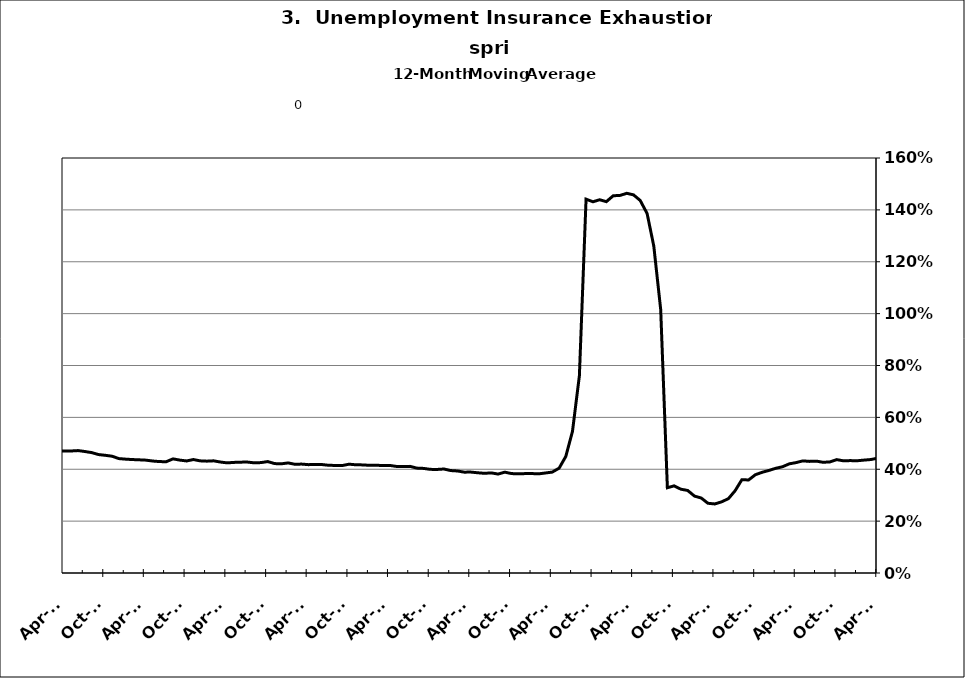
| Category | Series 0 |
|---|---|
| 2002-12-31 | 0.428 |
| 2003-01-31 | 0.432 |
| 2003-02-28 | 0.437 |
| 2003-03-31 | 0.445 |
| 2003-04-30 | 0.455 |
| 2003-05-31 | 0.466 |
| 2003-06-30 | 0.475 |
| 2003-07-31 | 0.485 |
| 2003-08-31 | 0.499 |
| 2003-09-30 | 0.502 |
| 2003-10-31 | 0.5 |
| 2003-11-30 | 0.506 |
| 2003-12-31 | 0.505 |
| 2004-01-31 | 0.505 |
| 2004-02-29 | 0.507 |
| 2004-03-31 | 0.501 |
| 2004-04-30 | 0.491 |
| 2004-05-31 | 0.486 |
| 2004-06-30 | 0.477 |
| 2004-07-31 | 0.466 |
| 2004-08-31 | 0.464 |
| 2004-09-30 | 0.452 |
| 2004-10-31 | 0.448 |
| 2004-11-30 | 0.44 |
| 2004-12-31 | 0.429 |
| 2005-01-31 | 0.429 |
| 2005-02-28 | 0.418 |
| 2005-03-31 | 0.412 |
| 2005-04-30 | 0.409 |
| 2005-05-31 | 0.404 |
| 2005-06-30 | 0.398 |
| 2005-07-31 | 0.4 |
| 2005-08-31 | 0.398 |
| 2005-09-30 | 0.398 |
| 2005-10-31 | 0.398 |
| 2005-11-30 | 0.392 |
| 2005-12-31 | 0.391 |
| 2006-01-31 | 0.388 |
| 2006-02-28 | 0.385 |
| 2006-03-31 | 0.381 |
| 2006-04-30 | 0.383 |
| 2006-05-31 | 0.387 |
| 2006-06-30 | 0.387 |
| 2006-07-31 | 0.393 |
| 2006-08-31 | 0.401 |
| 2006-09-30 | 0.415 |
| 2006-10-31 | 0.422 |
| 2006-11-30 | 0.423 |
| 2006-12-31 | 0.427 |
| 2007-01-31 | 0.425 |
| 2007-02-28 | 0.427 |
| 2007-03-31 | 0.431 |
| 2007-04-30 | 0.437 |
| 2007-05-31 | 0.434 |
| 2007-06-30 | 0.436 |
| 2007-07-30 | 0.443 |
| 2007-08-31 | 0.435 |
| 2007-09-30 | 0.437 |
| 2007-10-31 | 0.433 |
| 2007-11-15 | 0.438 |
| 2007-12-15 09:36:00 | 0.446 |
| 2008-01-14 19:12:00 | 0.447 |
| 2008-02-14 04:48:00 | 0.455 |
| 2008-03-15 14:24:00 | 0.462 |
| 2008-04-15 | 0.462 |
| 2008-05-15 09:36:00 | 0.467 |
| 2008-06-14 19:12:00 | 0.475 |
| 2008-07-15 04:48:00 | 0.47 |
| 2008-08-14 14:24:00 | 0.469 |
| 2008-09-14 | 0.473 |
| 2008-10-14 09:36:00 | 0.478 |
| 2008-11-13 19:12:00 | 0.489 |
| 2008-12-14 04:48:00 | 0.497 |
| 2009-01-13 14:24:00 | 0.51 |
| 2009-02-13 | 0.528 |
| 2009-03-15 09:36:00 | 0.547 |
| 2009-04-14 19:12:00 | 0.565 |
| 2009-05-15 04:48:00 | 0.582 |
| 2009-06-14 14:24:00 | 0.6 |
| 2009-07-15 | 0.611 |
| 2009-08-14 09:36:00 | 0.631 |
| 2009-09-13 19:12:00 | 0.623 |
| 2009-10-14 04:48:00 | 0.631 |
| 2009-11-13 14:24:00 | 0.65 |
| 2009-12-14 | 0.65 |
| 2010-01-13 09:36:00 | 0.657 |
| 2010-02-12 19:12:00 | 0.652 |
| 2010-03-15 04:48:00 | 0.649 |
| 2010-04-14 14:24:00 | 0.636 |
| 2010-05-15 | 0.623 |
| 2010-06-14 09:36:00 | 0.615 |
| 2010-07-14 19:12:00 | 0.604 |
| 2010-08-14 04:48:00 | 0.596 |
| 2010-09-13 14:24:00 | 0.591 |
| 2010-10-14 | 0.608 |
| 2010-11-13 09:36:00 | 0.605 |
| 2010-12-13 19:12:00 | 0.6 |
| 2011-01-13 04:48:00 | 0.602 |
| 2011-02-12 14:24:00 | 0.595 |
| 2011-03-15 | 0.587 |
| 2011-04-14 09:36:00 | 0.584 |
| 2011-05-14 19:12:00 | 0.591 |
| 2011-06-14 04:48:00 | 0.588 |
| 2011-07-14 14:24:00 | 0.582 |
| 2011-08-14 | 0.586 |
| 2011-09-13 09:36:00 | 0.59 |
| 2011-10-13 19:12:00 | 0.576 |
| 2011-11-13 04:48:00 | 0.561 |
| 2011-12-13 14:24:00 | 0.56 |
| 2012-01-13 | 0.555 |
| 2012-02-12 09:36:00 | 0.551 |
| 2012-03-13 19:12:00 | 0.544 |
| 2012-04-13 04:48:00 | 0.544 |
| 2012-05-13 14:24:00 | 0.535 |
| 2012-06-13 | 0.53 |
| 2012-07-13 09:36:00 | 0.535 |
| 2012-08-12 19:12:00 | 0.513 |
| 2012-09-12 04:48:00 | 0.506 |
| 2012-10-12 14:24:00 | 0.494 |
| 2012-11-12 | 0.484 |
| 2012-12-12 09:36:00 | 0.481 |
| 2013-01-11 19:12:00 | 0.465 |
| 2013-02-11 04:48:00 | 0.461 |
| 2013-03-13 14:24:00 | 0.462 |
| 2013-04-13 | 0.459 |
| 2013-05-13 09:36:00 | 0.458 |
| 2013-06-12 19:12:00 | 0.452 |
| 2013-07-13 04:48:00 | 0.451 |
| 2013-08-12 14:24:00 | 0.454 |
| 2013-09-12 | 0.465 |
| 2013-10-12 09:36:00 | 0.463 |
| 2013-11-11 19:12:00 | 0.466 |
| 2013-12-12 04:48:00 | 0.475 |
| 2014-01-11 14:24:00 | 0.477 |
| 2014-02-11 | 0.475 |
| 2014-03-13 09:36:00 | 0.471 |
| 2014-04-12 19:12:00 | 0.47 |
| 2014-05-13 04:48:00 | 0.471 |
| 2014-06-12 14:24:00 | 0.472 |
| 2014-07-13 | 0.468 |
| 2014-08-12 09:36:00 | 0.464 |
| 2014-09-11 19:12:00 | 0.457 |
| 2014-10-12 04:48:00 | 0.454 |
| 2014-11-11 14:24:00 | 0.45 |
| 2014-12-12 | 0.441 |
| 2015-01-11 09:36:00 | 0.439 |
| 2015-02-10 19:12:00 | 0.437 |
| 2015-03-13 04:48:00 | 0.436 |
| 2015-04-12 14:24:00 | 0.435 |
| 2015-05-13 | 0.432 |
| 2015-06-12 09:36:00 | 0.43 |
| 2015-07-12 19:12:00 | 0.429 |
| 2015-08-12 04:48:00 | 0.44 |
| 2015-09-11 14:24:00 | 0.435 |
| 2015-10-12 | 0.432 |
| 2015-11-11 09:36:00 | 0.437 |
| 2015-12-11 19:12:00 | 0.432 |
| 2016-01-11 04:48:00 | 0.431 |
| 2016-02-10 14:24:00 | 0.432 |
| 2016-03-12 | 0.428 |
| 2016-04-11 09:36:00 | 0.425 |
| 2016-05-11 19:12:00 | 0.426 |
| 2016-06-11 04:48:00 | 0.427 |
| 2016-07-11 14:24:00 | 0.428 |
| 2016-08-11 | 0.425 |
| 2016-09-10 09:36:00 | 0.426 |
| 2016-10-10 19:12:00 | 0.43 |
| 2016-11-10 04:48:00 | 0.422 |
| 2016-12-10 14:24:00 | 0.421 |
| 2017-01-10 | 0.424 |
| 2017-02-09 09:36:00 | 0.419 |
| 2017-03-11 19:12:00 | 0.42 |
| 2017-04-11 04:48:00 | 0.418 |
| 2017-05-11 14:24:00 | 0.418 |
| 2017-06-11 | 0.418 |
| 2017-07-11 09:36:00 | 0.415 |
| 2017-08-10 19:12:00 | 0.415 |
| 2017-09-10 04:48:00 | 0.414 |
| 2017-10-10 14:24:00 | 0.42 |
| 2017-11-10 | 0.417 |
| 2017-12-10 09:36:00 | 0.417 |
| 2018-01-09 19:12:00 | 0.415 |
| 2018-02-09 04:48:00 | 0.416 |
| 2018-03-11 14:24:00 | 0.414 |
| 2018-04-11 | 0.415 |
| 2018-05-11 09:36:00 | 0.411 |
| 2018-06-10 19:12:00 | 0.41 |
| 2018-07-11 04:48:00 | 0.411 |
| 2018-08-10 14:24:00 | 0.404 |
| 2018-09-10 | 0.403 |
| 2018-10-10 09:36:00 | 0.4 |
| 2018-11-09 19:12:00 | 0.399 |
| 2018-12-10 04:48:00 | 0.401 |
| 2019-01-09 14:24:00 | 0.395 |
| 2019-02-09 | 0.393 |
| 2019-03-11 09:36:00 | 0.389 |
| 2019-04-10 19:12:00 | 0.389 |
| 2019-05-11 04:48:00 | 0.386 |
| 2019-06-10 14:24:00 | 0.384 |
| 2019-07-11 | 0.386 |
| 2019-08-10 09:36:00 | 0.381 |
| 2019-09-09 19:12:00 | 0.389 |
| 2019-10-10 04:48:00 | 0.383 |
| 2019-11-09 14:24:00 | 0.382 |
| 2019-12-10 | 0.383 |
| 2020-01-09 09:36:00 | 0.383 |
| 2020-02-08 19:12:00 | 0.382 |
| 2020-03-10 04:48:00 | 0.386 |
| 2020-04-09 14:24:00 | 0.389 |
| 2020-05-10 | 0.404 |
| 2020-06-09 09:36:00 | 0.449 |
| 2020-07-09 19:12:00 | 0.546 |
| 2020-08-09 04:48:00 | 0.76 |
| 2020-09-08 14:24:00 | 1.441 |
| 2020-10-09 | 1.431 |
| 2020-11-08 09:36:00 | 1.439 |
| 2020-12-08 19:12:00 | 1.432 |
| 2021-01-08 04:48:00 | 1.455 |
| 2021-02-07 14:24:00 | 1.456 |
| 2021-03-10 | 1.464 |
| 2021-04-09 09:36:00 | 1.458 |
| 2021-05-09 19:12:00 | 1.436 |
| 2021-06-09 04:48:00 | 1.386 |
| 2021-07-09 14:24:00 | 1.261 |
| 2021-08-09 | 1.016 |
| 2021-09-08 09:36:00 | 0.329 |
| 2021-10-08 19:12:00 | 0.336 |
| 2021-11-08 04:48:00 | 0.323 |
| 2021-12-08 14:24:00 | 0.318 |
| 2022-01-08 | 0.296 |
| 2022-02-07 09:36:00 | 0.289 |
| 2022-03-09 19:12:00 | 0.269 |
| 2022-04-09 04:48:00 | 0.266 |
| 2022-05-09 14:24:00 | 0.274 |
| 2022-06-09 | 0.287 |
| 2022-07-09 09:36:00 | 0.317 |
| 2022-08-08 19:12:00 | 0.359 |
| 2022-09-08 04:48:00 | 0.359 |
| 2022-10-08 14:24:00 | 0.379 |
| 2022-11-08 | 0.388 |
| 2022-12-08 09:36:00 | 0.395 |
| 2023-01-07 19:12:00 | 0.404 |
| 2023-02-07 04:48:00 | 0.41 |
| 2023-03-09 14:24:00 | 0.421 |
| 2023-04-09 | 0.426 |
| 2023-05-09 09:36:00 | 0.432 |
| 2023-06-08 19:12:00 | 0.43 |
| 2023-07-09 04:48:00 | 0.431 |
| 2023-08-08 14:24:00 | 0.427 |
| 2023-09-08 | 0.428 |
| 2023-10-08 09:36:00 | 0.437 |
| 2023-11-07 19:12:00 | 0.433 |
| 2023-12-08 04:48:00 | 0.433 |
| 2024-01-07 14:24:00 | 0.433 |
| 2024-02-07 | 0.435 |
| 2024-03-08 09:36:00 | 0.437 |
| 2024-04-07 19:12:00 | 0.442 |